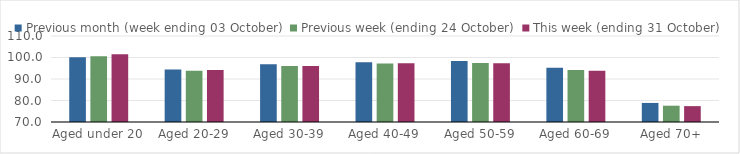
| Category | Previous month (week ending 03 October) | Previous week (ending 24 October) | This week (ending 31 October) |
|---|---|---|---|
| Aged under 20 | 100.1 | 100.61 | 101.47 |
| Aged 20-29 | 94.37 | 93.86 | 94.22 |
| Aged 30-39 | 96.85 | 96.05 | 95.99 |
| Aged 40-49 | 97.79 | 97.26 | 97.33 |
| Aged 50-59 | 98.38 | 97.46 | 97.38 |
| Aged 60-69 | 95.21 | 94.18 | 93.85 |
| Aged 70+ | 78.87 | 77.58 | 77.38 |